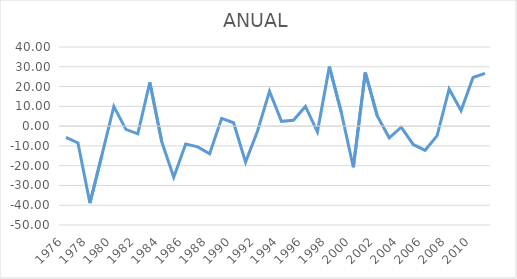
| Category | ANUAL |
|---|---|
| 1976.0 | -5.684 |
| 1977.0 | -8.528 |
| 1978.0 | -38.925 |
| 1979.0 | -14.7 |
| 1980.0 | 9.96 |
| 1981.0 | -1.637 |
| 1982.0 | -3.893 |
| 1983.0 | 22.15 |
| 1984.0 | -7.936 |
| 1985.0 | -25.858 |
| 1986.0 | -9.03 |
| 1987.0 | -10.499 |
| 1988.0 | -13.963 |
| 1989.0 | 3.929 |
| 1990.0 | 1.704 |
| 1991.0 | -18.217 |
| 1992.0 | -2.433 |
| 1993.0 | 17.66 |
| 1994.0 | 2.418 |
| 1995.0 | 2.975 |
| 1996.0 | 9.956 |
| 1997.0 | -2.908 |
| 1998.0 | 30.071 |
| 1999.0 | 6.804 |
| 2000.0 | -20.817 |
| 2001.0 | 27.119 |
| 2002.0 | 5.118 |
| 2003.0 | -5.928 |
| 2004.0 | -0.52 |
| 2005.0 | -9.278 |
| 2006.0 | -12.222 |
| 2007.0 | -4.793 |
| 2008.0 | 18.799 |
| 2009.0 | 7.862 |
| 2010.0 | 24.6 |
| 2011.0 | 26.644 |